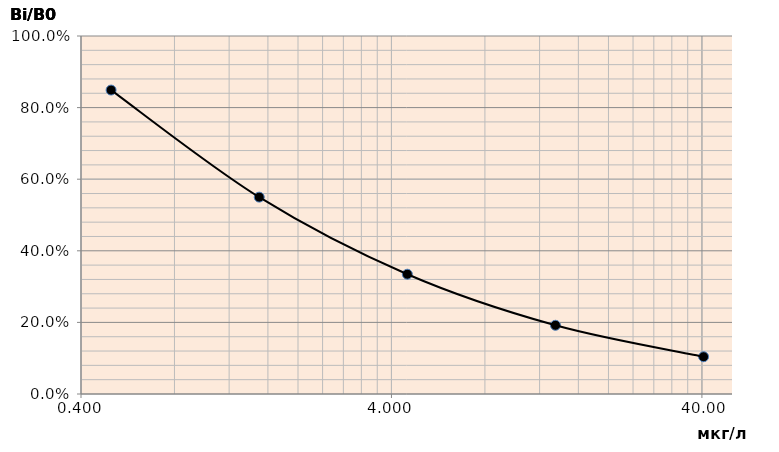
| Category | Series 0 |
|---|---|
| 0.5 | 0.849 |
| 1.5 | 0.55 |
| 4.5 | 0.335 |
| 13.5 | 0.192 |
| 40.5 | 0.104 |